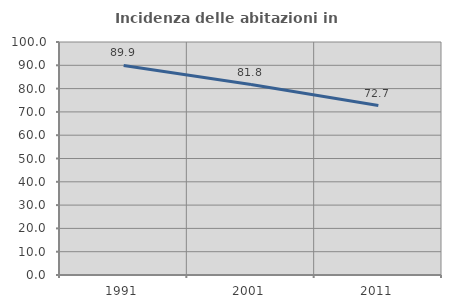
| Category | Incidenza delle abitazioni in proprietà  |
|---|---|
| 1991.0 | 89.922 |
| 2001.0 | 81.75 |
| 2011.0 | 72.744 |